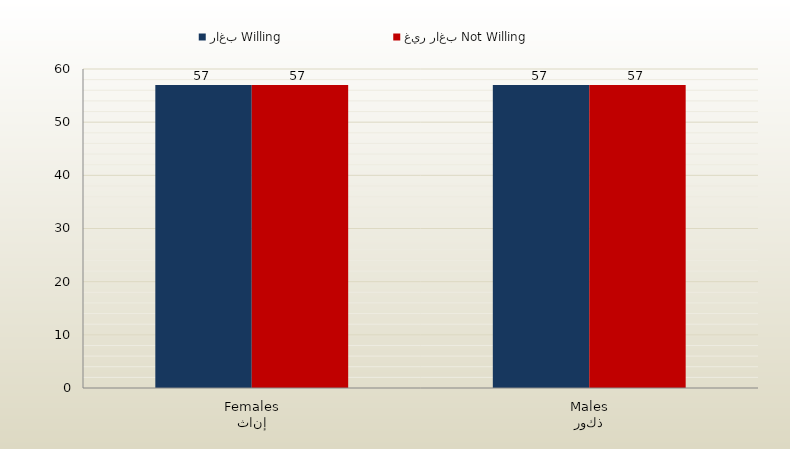
| Category | راغب Willing | غير راغب Not Willing |
|---|---|---|
| إناث
Females | 57 | 57 |
| ذكور
Males | 57 | 57 |